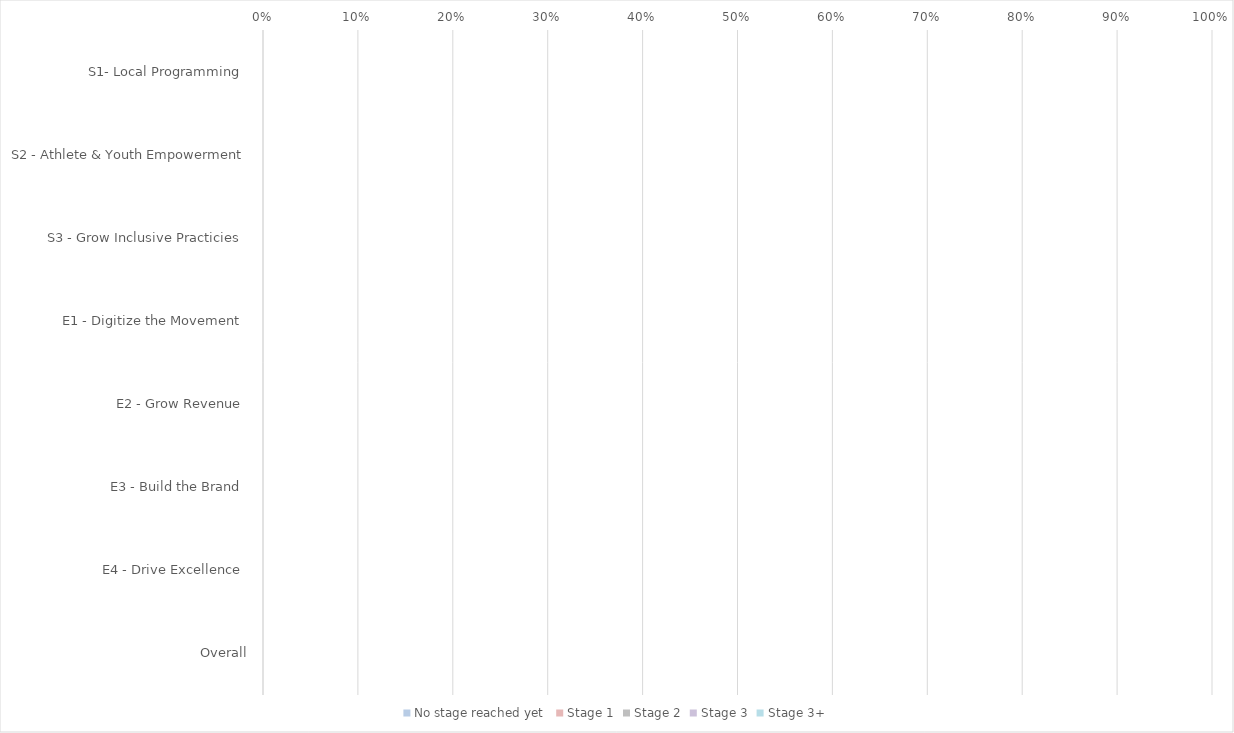
| Category | No stage reached yet  | Stage 1 | Stage 2 | Stage 3 | Stage 3+ |
|---|---|---|---|---|---|
| S1- Local Programming  | 0 | 0 | 0 | 0 | 0 |
| S2 - Athlete & Youth Empowerment | 0 | 0 | 0 | 0 | 0 |
| S3 - Grow Inclusive Practicies  | 0 | 0 | 0 | 0 | 0 |
| E1 - Digitize the Movement  | 0 | 0 | 0 | 0 | 0 |
| E2 - Grow Revenue  | 0 | 0 | 0 | 0 | 0 |
| E3 - Build the Brand  | 0 | 0 | 0 | 0 | 0 |
| E4 - Drive Excellence  | 0 | 0 | 0 | 0 | 0 |
| Overall | 0 | 0 | 0 | 0 | 0 |